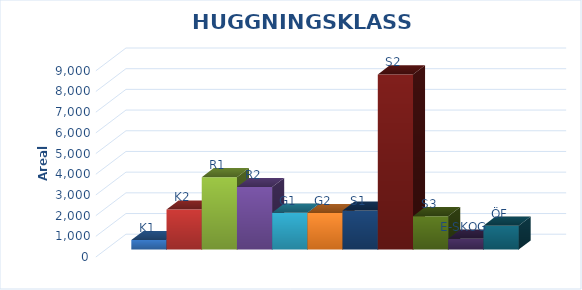
| Category | K1 | K2 | R1 | R2 | G1 | G2 | S1 | S2 | S3 | E-SKOG | ÖF |
|---|---|---|---|---|---|---|---|---|---|---|---|
| 0 | 458 | 1936 | 3497 | 3020 | 1782 | 1761 | 1885 | 8464 | 1611 | 525 |  |